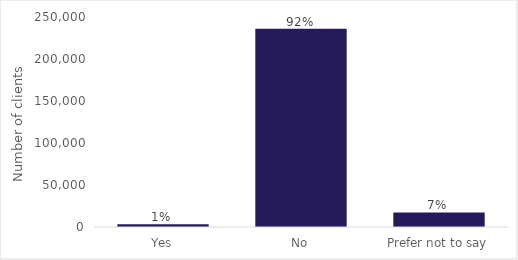
| Category | Series 0 |
|---|---|
| Yes | 3305 |
| No | 236005 |
| Prefer not to say | 17280 |